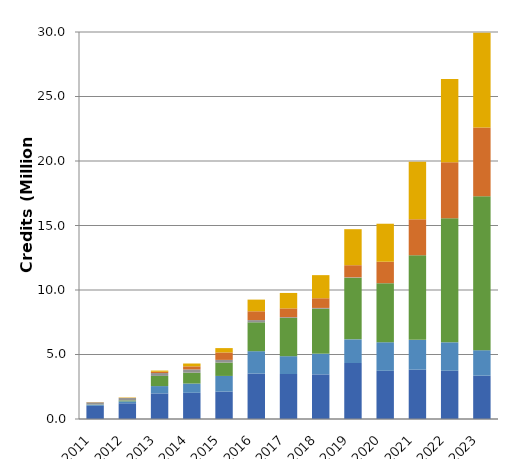
| Category | Ethanol | Biodiesel | Renewable Diesel | Fossil Natural Gas | Biomethane | Electricity |
|---|---|---|---|---|---|---|
| 2011.0 | 1.024 | 0.084 | 0.017 | 0.164 | 0.015 | 0.008 |
| 2012.0 | 1.219 | 0.149 | 0.073 | 0.183 | 0.015 | 0.027 |
| 2013.0 | 1.984 | 0.567 | 0.79 | 0.222 | 0.098 | 0.094 |
| 2014.0 | 2.031 | 0.718 | 0.845 | 0.247 | 0.24 | 0.221 |
| 2015.0 | 2.125 | 1.214 | 1.038 | 0.206 | 0.576 | 0.338 |
| 2016.0 | 3.519 | 1.737 | 2.241 | 0.17 | 0.683 | 0.905 |
| 2017.0 | 3.488 | 1.38 | 2.967 | 0.058 | 0.681 | 1.198 |
| 2018.0 | 3.459 | 1.607 | 3.485 | 0.059 | 0.751 | 1.791 |
| 2019.0 | 4.342 | 1.831 | 4.781 | 0.031 | 0.937 | 2.793 |
| 2020.0 | 3.737 | 2.213 | 4.571 | 0.008 | 1.665 | 2.943 |
| 2021.0 | 3.826 | 2.311 | 6.556 | 0.002 | 2.787 | 4.467 |
| 2022.0 | 3.741 | 2.205 | 9.617 | 0.003 | 4.345 | 6.451 |
| 2023.0 | 3.363 | 1.97 | 11.929 | 0.002 | 5.326 | 7.343 |